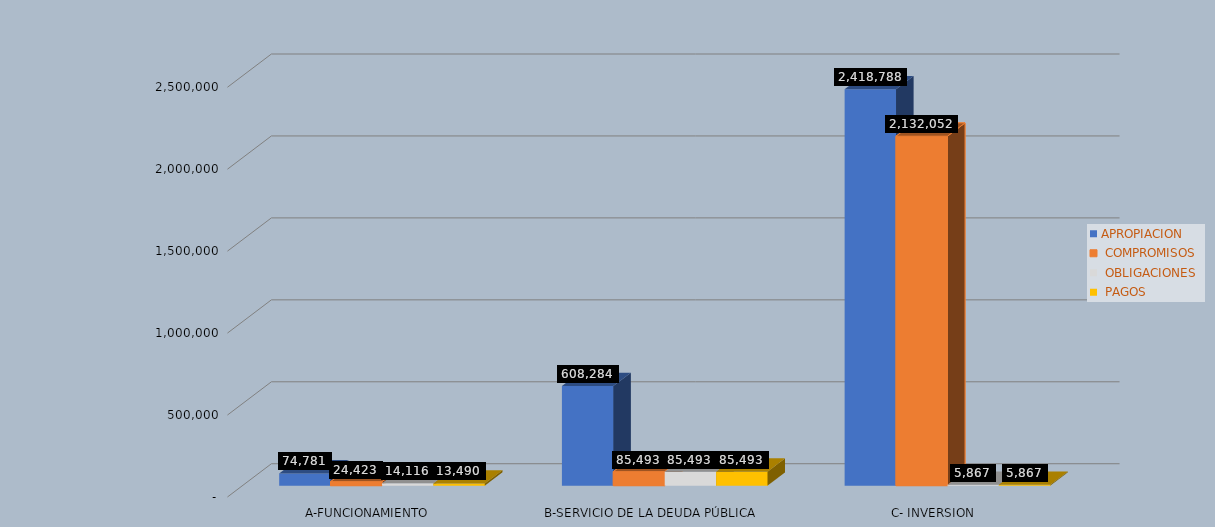
| Category | APROPIACION |  COMPROMISOS |  OBLIGACIONES |  PAGOS |
|---|---|---|---|---|
| A-FUNCIONAMIENTO | 74780.665 | 24423.273 | 14116.05 | 13490.096 |
| B-SERVICIO DE LA DEUDA PÚBLICA | 608283.882 | 85493.155 | 85493.155 | 85493.155 |
| C- INVERSION | 2418788.029 | 2132051.642 | 5867.055 | 5867.055 |